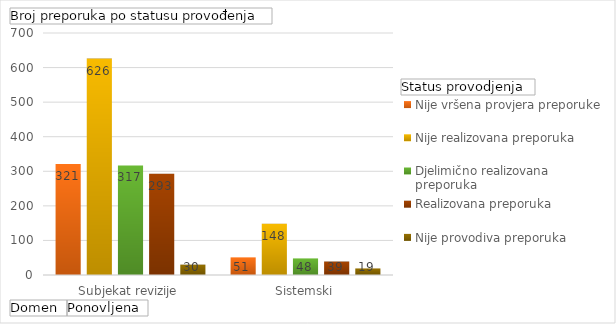
| Category | Nije vršena provjera preporuke | Nije realizovana preporuka | Djelimično realizovana preporuka | Realizovana preporuka | Nije provodiva preporuka |
|---|---|---|---|---|---|
| Subjekat revizije | 321 | 626 | 317 | 293 | 30 |
| Sistemski | 51 | 148 | 48 | 39 | 19 |